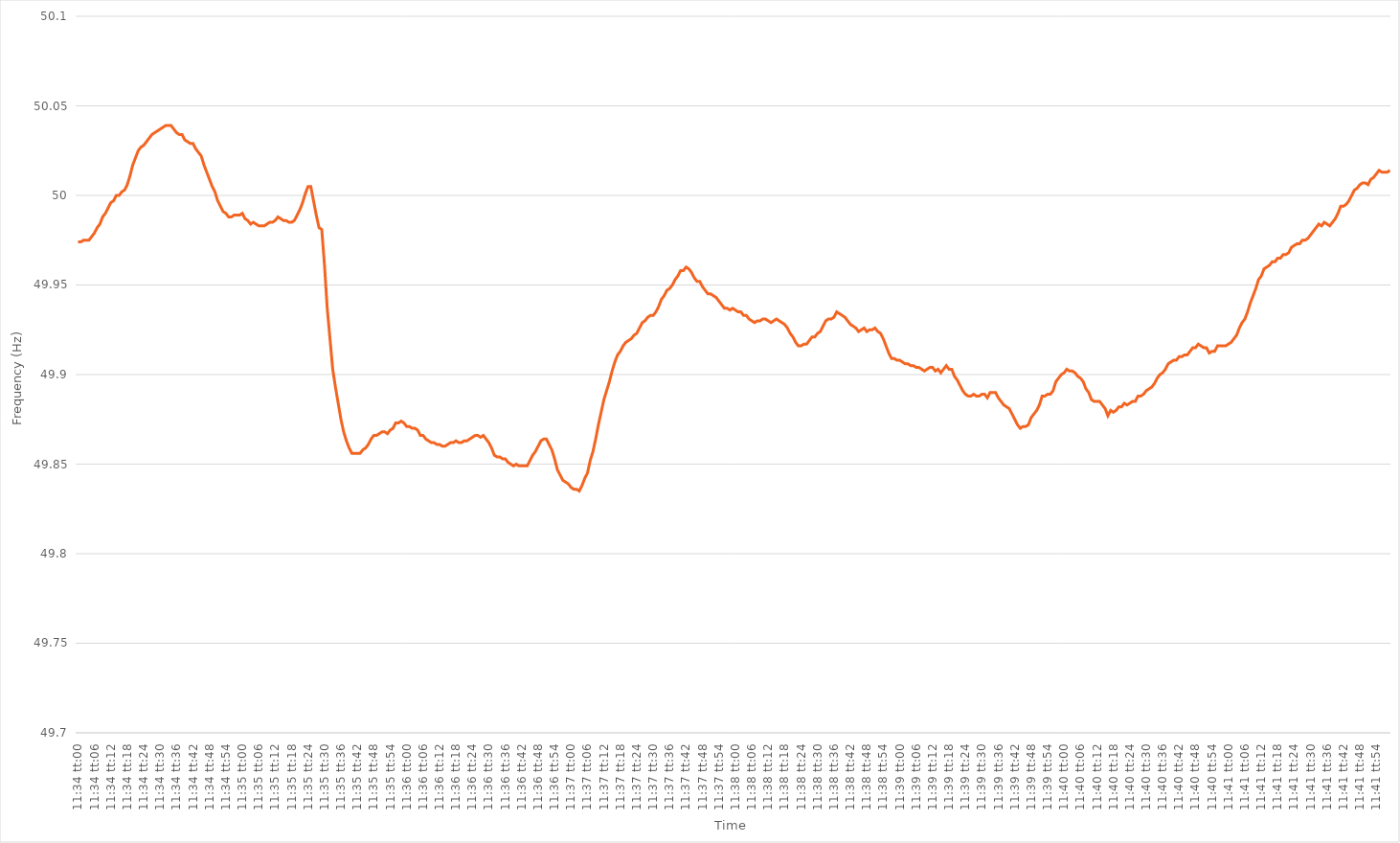
| Category | Series 0 |
|---|---|
| 0.48194444444444445 | 49.974 |
| 0.48195601851851855 | 49.974 |
| 0.4819675925925926 | 49.975 |
| 0.4819791666666667 | 49.975 |
| 0.4819907407407407 | 49.975 |
| 0.48200231481481487 | 49.977 |
| 0.4820138888888889 | 49.979 |
| 0.48202546296296295 | 49.982 |
| 0.48203703703703704 | 49.984 |
| 0.4820486111111111 | 49.988 |
| 0.4820601851851852 | 49.99 |
| 0.4820717592592592 | 49.993 |
| 0.48208333333333336 | 49.996 |
| 0.4820949074074074 | 49.997 |
| 0.4821064814814815 | 50 |
| 0.48211805555555554 | 50 |
| 0.48212962962962963 | 50.002 |
| 0.48214120370370367 | 50.003 |
| 0.4821527777777778 | 50.006 |
| 0.48216435185185186 | 50.011 |
| 0.48217592592592595 | 50.017 |
| 0.4821875 | 50.021 |
| 0.4821990740740741 | 50.025 |
| 0.4822106481481481 | 50.027 |
| 0.4822222222222223 | 50.028 |
| 0.4822337962962963 | 50.03 |
| 0.48224537037037035 | 50.032 |
| 0.48225694444444445 | 50.034 |
| 0.4822685185185185 | 50.035 |
| 0.4822800925925926 | 50.036 |
| 0.4822916666666666 | 50.037 |
| 0.48230324074074077 | 50.038 |
| 0.4823148148148148 | 50.039 |
| 0.4823263888888889 | 50.039 |
| 0.48233796296296294 | 50.039 |
| 0.48234953703703703 | 50.037 |
| 0.4823611111111111 | 50.035 |
| 0.4823726851851852 | 50.034 |
| 0.48238425925925926 | 50.034 |
| 0.48239583333333336 | 50.031 |
| 0.4824074074074074 | 50.03 |
| 0.4824189814814815 | 50.029 |
| 0.48243055555555553 | 50.029 |
| 0.4824421296296297 | 50.026 |
| 0.4824537037037037 | 50.024 |
| 0.4824652777777778 | 50.022 |
| 0.48247685185185185 | 50.017 |
| 0.4824884259259259 | 50.013 |
| 0.4825 | 50.009 |
| 0.482511574074074 | 50.005 |
| 0.4825231481481482 | 50.002 |
| 0.4825347222222222 | 49.997 |
| 0.4825462962962963 | 49.994 |
| 0.48255787037037035 | 49.991 |
| 0.48256944444444444 | 49.99 |
| 0.4825810185185185 | 49.988 |
| 0.48259259259259263 | 49.988 |
| 0.48260416666666667 | 49.989 |
| 0.48261574074074076 | 49.989 |
| 0.4826273148148148 | 49.989 |
| 0.4826388888888889 | 49.99 |
| 0.48265046296296293 | 49.987 |
| 0.4826620370370371 | 49.986 |
| 0.4826736111111111 | 49.984 |
| 0.4826851851851852 | 49.985 |
| 0.48269675925925926 | 49.984 |
| 0.48270833333333335 | 49.983 |
| 0.4827199074074074 | 49.983 |
| 0.48273148148148143 | 49.983 |
| 0.4827430555555556 | 49.984 |
| 0.4827546296296296 | 49.985 |
| 0.4827662037037037 | 49.985 |
| 0.48277777777777775 | 49.986 |
| 0.48278935185185184 | 49.988 |
| 0.4828009259259259 | 49.987 |
| 0.48281250000000003 | 49.986 |
| 0.48282407407407407 | 49.986 |
| 0.48283564814814817 | 49.985 |
| 0.4828472222222222 | 49.985 |
| 0.4828587962962963 | 49.986 |
| 0.48287037037037034 | 49.989 |
| 0.4828819444444445 | 49.992 |
| 0.4828935185185185 | 49.996 |
| 0.4829050925925926 | 50.001 |
| 0.48291666666666666 | 50.005 |
| 0.48292824074074076 | 50.005 |
| 0.4829398148148148 | 49.997 |
| 0.48295138888888894 | 49.989 |
| 0.482962962962963 | 49.982 |
| 0.482974537037037 | 49.981 |
| 0.4829861111111111 | 49.961 |
| 0.48299768518518515 | 49.937 |
| 0.48300925925925925 | 49.92 |
| 0.4830208333333333 | 49.903 |
| 0.48303240740740744 | 49.893 |
| 0.4830439814814815 | 49.884 |
| 0.48305555555555557 | 49.875 |
| 0.4830671296296296 | 49.868 |
| 0.4830787037037037 | 49.863 |
| 0.48309027777777774 | 49.859 |
| 0.4831018518518519 | 49.856 |
| 0.48311342592592593 | 49.856 |
| 0.483125 | 49.856 |
| 0.48313657407407407 | 49.856 |
| 0.48314814814814816 | 49.858 |
| 0.4831597222222222 | 49.859 |
| 0.48317129629629635 | 49.861 |
| 0.4831828703703704 | 49.864 |
| 0.4831944444444444 | 49.866 |
| 0.4832060185185185 | 49.866 |
| 0.48321759259259256 | 49.867 |
| 0.48322916666666665 | 49.868 |
| 0.4832407407407407 | 49.868 |
| 0.48325231481481484 | 49.867 |
| 0.4832638888888889 | 49.869 |
| 0.483275462962963 | 49.87 |
| 0.483287037037037 | 49.873 |
| 0.4832986111111111 | 49.873 |
| 0.48331018518518515 | 49.874 |
| 0.4833217592592593 | 49.873 |
| 0.48333333333333334 | 49.871 |
| 0.48334490740740743 | 49.871 |
| 0.48335648148148147 | 49.87 |
| 0.48336805555555556 | 49.87 |
| 0.4833796296296296 | 49.869 |
| 0.48339120370370375 | 49.866 |
| 0.4834027777777778 | 49.866 |
| 0.4834143518518519 | 49.864 |
| 0.4834259259259259 | 49.863 |
| 0.48343749999999996 | 49.862 |
| 0.48344907407407406 | 49.862 |
| 0.4834606481481481 | 49.861 |
| 0.48347222222222225 | 49.861 |
| 0.4834837962962963 | 49.86 |
| 0.4834953703703704 | 49.86 |
| 0.4835069444444444 | 49.861 |
| 0.4835185185185185 | 49.862 |
| 0.48353009259259255 | 49.862 |
| 0.4835416666666667 | 49.863 |
| 0.48355324074074074 | 49.862 |
| 0.48356481481481484 | 49.862 |
| 0.4835763888888889 | 49.863 |
| 0.48358796296296297 | 49.863 |
| 0.483599537037037 | 49.864 |
| 0.48361111111111116 | 49.865 |
| 0.4836226851851852 | 49.866 |
| 0.4836342592592593 | 49.866 |
| 0.48364583333333333 | 49.865 |
| 0.4836574074074074 | 49.866 |
| 0.48366898148148146 | 49.864 |
| 0.4836805555555555 | 49.862 |
| 0.48369212962962965 | 49.859 |
| 0.4837037037037037 | 49.855 |
| 0.4837152777777778 | 49.854 |
| 0.4837268518518518 | 49.854 |
| 0.4837384259259259 | 49.853 |
| 0.48374999999999996 | 49.853 |
| 0.4837615740740741 | 49.851 |
| 0.48377314814814815 | 49.85 |
| 0.48378472222222224 | 49.849 |
| 0.4837962962962963 | 49.85 |
| 0.4838078703703704 | 49.849 |
| 0.4838194444444444 | 49.849 |
| 0.48383101851851856 | 49.849 |
| 0.4838425925925926 | 49.849 |
| 0.4838541666666667 | 49.852 |
| 0.48386574074074074 | 49.855 |
| 0.48387731481481483 | 49.857 |
| 0.48388888888888887 | 49.86 |
| 0.483900462962963 | 49.863 |
| 0.48391203703703706 | 49.864 |
| 0.4839236111111111 | 49.864 |
| 0.4839351851851852 | 49.861 |
| 0.48394675925925923 | 49.858 |
| 0.4839583333333333 | 49.853 |
| 0.48396990740740736 | 49.847 |
| 0.4839814814814815 | 49.844 |
| 0.48399305555555555 | 49.841 |
| 0.48400462962962965 | 49.84 |
| 0.4840162037037037 | 49.839 |
| 0.4840277777777778 | 49.837 |
| 0.4840393518518518 | 49.836 |
| 0.48405092592592597 | 49.836 |
| 0.4840625 | 49.835 |
| 0.4840740740740741 | 49.838 |
| 0.48408564814814814 | 49.842 |
| 0.48409722222222223 | 49.845 |
| 0.4841087962962963 | 49.852 |
| 0.4841203703703704 | 49.857 |
| 0.48413194444444446 | 49.864 |
| 0.4841435185185185 | 49.872 |
| 0.4841550925925926 | 49.879 |
| 0.48416666666666663 | 49.886 |
| 0.48417824074074073 | 49.891 |
| 0.48418981481481477 | 49.896 |
| 0.4842013888888889 | 49.902 |
| 0.48421296296296296 | 49.907 |
| 0.48422453703703705 | 49.911 |
| 0.4842361111111111 | 49.913 |
| 0.4842476851851852 | 49.916 |
| 0.4842592592592592 | 49.918 |
| 0.4842708333333334 | 49.919 |
| 0.4842824074074074 | 49.92 |
| 0.4842939814814815 | 49.922 |
| 0.48430555555555554 | 49.923 |
| 0.48431712962962964 | 49.926 |
| 0.4843287037037037 | 49.929 |
| 0.48434027777777783 | 49.93 |
| 0.48435185185185187 | 49.932 |
| 0.48436342592592596 | 49.933 |
| 0.484375 | 49.933 |
| 0.48438657407407404 | 49.935 |
| 0.48439814814814813 | 49.938 |
| 0.48440972222222217 | 49.942 |
| 0.4844212962962963 | 49.944 |
| 0.48443287037037036 | 49.947 |
| 0.48444444444444446 | 49.948 |
| 0.4844560185185185 | 49.95 |
| 0.4844675925925926 | 49.953 |
| 0.4844791666666666 | 49.955 |
| 0.4844907407407408 | 49.958 |
| 0.4845023148148148 | 49.958 |
| 0.4845138888888889 | 49.96 |
| 0.48452546296296295 | 49.959 |
| 0.48453703703703704 | 49.957 |
| 0.4845486111111111 | 49.954 |
| 0.48456018518518523 | 49.952 |
| 0.48457175925925927 | 49.952 |
| 0.48458333333333337 | 49.949 |
| 0.4845949074074074 | 49.947 |
| 0.4846064814814815 | 49.945 |
| 0.48461805555555554 | 49.945 |
| 0.4846296296296296 | 49.944 |
| 0.4846412037037037 | 49.943 |
| 0.48465277777777777 | 49.941 |
| 0.48466435185185186 | 49.939 |
| 0.4846759259259259 | 49.937 |
| 0.4846875 | 49.937 |
| 0.48469907407407403 | 49.936 |
| 0.4847106481481482 | 49.937 |
| 0.4847222222222222 | 49.936 |
| 0.4847337962962963 | 49.935 |
| 0.48474537037037035 | 49.935 |
| 0.48475694444444445 | 49.933 |
| 0.4847685185185185 | 49.933 |
| 0.48478009259259264 | 49.931 |
| 0.4847916666666667 | 49.93 |
| 0.48480324074074077 | 49.929 |
| 0.4848148148148148 | 49.93 |
| 0.4848263888888889 | 49.93 |
| 0.48483796296296294 | 49.931 |
| 0.484849537037037 | 49.931 |
| 0.48486111111111113 | 49.93 |
| 0.48487268518518517 | 49.929 |
| 0.48488425925925926 | 49.93 |
| 0.4848958333333333 | 49.931 |
| 0.4849074074074074 | 49.93 |
| 0.48491898148148144 | 49.929 |
| 0.4849305555555556 | 49.928 |
| 0.4849421296296296 | 49.926 |
| 0.4849537037037037 | 49.923 |
| 0.48496527777777776 | 49.921 |
| 0.48497685185185185 | 49.918 |
| 0.4849884259259259 | 49.916 |
| 0.48500000000000004 | 49.916 |
| 0.4850115740740741 | 49.917 |
| 0.4850231481481482 | 49.917 |
| 0.4850347222222222 | 49.919 |
| 0.4850462962962963 | 49.921 |
| 0.48505787037037035 | 49.921 |
| 0.4850694444444445 | 49.923 |
| 0.48508101851851854 | 49.924 |
| 0.4850925925925926 | 49.927 |
| 0.48510416666666667 | 49.93 |
| 0.4851157407407407 | 49.931 |
| 0.4851273148148148 | 49.931 |
| 0.48513888888888884 | 49.932 |
| 0.485150462962963 | 49.935 |
| 0.48516203703703703 | 49.934 |
| 0.4851736111111111 | 49.933 |
| 0.48518518518518516 | 49.932 |
| 0.48519675925925926 | 49.93 |
| 0.4852083333333333 | 49.928 |
| 0.48521990740740745 | 49.927 |
| 0.4852314814814815 | 49.926 |
| 0.4852430555555556 | 49.924 |
| 0.4852546296296296 | 49.925 |
| 0.4852662037037037 | 49.926 |
| 0.48527777777777775 | 49.924 |
| 0.4852893518518519 | 49.925 |
| 0.48530092592592594 | 49.925 |
| 0.48531250000000004 | 49.926 |
| 0.4853240740740741 | 49.924 |
| 0.4853356481481481 | 49.923 |
| 0.4853472222222222 | 49.92 |
| 0.48535879629629625 | 49.916 |
| 0.4853703703703704 | 49.912 |
| 0.48538194444444444 | 49.909 |
| 0.48539351851851853 | 49.909 |
| 0.48540509259259257 | 49.908 |
| 0.48541666666666666 | 49.908 |
| 0.4854282407407407 | 49.907 |
| 0.48543981481481485 | 49.906 |
| 0.4854513888888889 | 49.906 |
| 0.485462962962963 | 49.905 |
| 0.485474537037037 | 49.905 |
| 0.4854861111111111 | 49.904 |
| 0.48549768518518516 | 49.904 |
| 0.4855092592592593 | 49.903 |
| 0.48552083333333335 | 49.902 |
| 0.48553240740740744 | 49.903 |
| 0.4855439814814815 | 49.904 |
| 0.4855555555555556 | 49.904 |
| 0.4855671296296296 | 49.902 |
| 0.48557870370370365 | 49.903 |
| 0.4855902777777778 | 49.901 |
| 0.48560185185185184 | 49.903 |
| 0.48561342592592593 | 49.905 |
| 0.485625 | 49.903 |
| 0.48563657407407407 | 49.903 |
| 0.4856481481481481 | 49.899 |
| 0.48565972222222226 | 49.897 |
| 0.4856712962962963 | 49.894 |
| 0.4856828703703704 | 49.891 |
| 0.48569444444444443 | 49.889 |
| 0.4857060185185185 | 49.888 |
| 0.48571759259259256 | 49.888 |
| 0.4857291666666667 | 49.889 |
| 0.48574074074074075 | 49.888 |
| 0.48575231481481485 | 49.888 |
| 0.4857638888888889 | 49.889 |
| 0.485775462962963 | 49.889 |
| 0.485787037037037 | 49.887 |
| 0.48579861111111106 | 49.89 |
| 0.4858101851851852 | 49.89 |
| 0.48582175925925924 | 49.89 |
| 0.48583333333333334 | 49.887 |
| 0.4858449074074074 | 49.885 |
| 0.4858564814814815 | 49.883 |
| 0.4858680555555555 | 49.882 |
| 0.48587962962962966 | 49.881 |
| 0.4858912037037037 | 49.878 |
| 0.4859027777777778 | 49.875 |
| 0.48591435185185183 | 49.872 |
| 0.48592592592592593 | 49.87 |
| 0.48593749999999997 | 49.871 |
| 0.4859490740740741 | 49.871 |
| 0.48596064814814816 | 49.872 |
| 0.48597222222222225 | 49.876 |
| 0.4859837962962963 | 49.878 |
| 0.4859953703703704 | 49.88 |
| 0.4860069444444444 | 49.883 |
| 0.48601851851851857 | 49.888 |
| 0.4860300925925926 | 49.888 |
| 0.48604166666666665 | 49.889 |
| 0.48605324074074074 | 49.889 |
| 0.4860648148148148 | 49.891 |
| 0.4860763888888889 | 49.896 |
| 0.4860879629629629 | 49.898 |
| 0.48609953703703707 | 49.9 |
| 0.4861111111111111 | 49.901 |
| 0.4861226851851852 | 49.903 |
| 0.48613425925925924 | 49.902 |
| 0.48614583333333333 | 49.902 |
| 0.48615740740740737 | 49.901 |
| 0.4861689814814815 | 49.899 |
| 0.48618055555555556 | 49.898 |
| 0.48619212962962965 | 49.896 |
| 0.4862037037037037 | 49.892 |
| 0.4862152777777778 | 49.89 |
| 0.4862268518518518 | 49.886 |
| 0.486238425925926 | 49.885 |
| 0.48625 | 49.885 |
| 0.4862615740740741 | 49.885 |
| 0.48627314814814815 | 49.883 |
| 0.4862847222222222 | 49.881 |
| 0.4862962962962963 | 49.877 |
| 0.4863078703703703 | 49.88 |
| 0.48631944444444447 | 49.879 |
| 0.4863310185185185 | 49.88 |
| 0.4863425925925926 | 49.882 |
| 0.48635416666666664 | 49.882 |
| 0.48636574074074074 | 49.884 |
| 0.4863773148148148 | 49.883 |
| 0.4863888888888889 | 49.884 |
| 0.48640046296296297 | 49.885 |
| 0.48641203703703706 | 49.885 |
| 0.4864236111111111 | 49.888 |
| 0.4864351851851852 | 49.888 |
| 0.48644675925925923 | 49.889 |
| 0.4864583333333334 | 49.891 |
| 0.4864699074074074 | 49.892 |
| 0.4864814814814815 | 49.893 |
| 0.48649305555555555 | 49.895 |
| 0.48650462962962965 | 49.898 |
| 0.4865162037037037 | 49.9 |
| 0.4865277777777777 | 49.901 |
| 0.4865393518518519 | 49.903 |
| 0.4865509259259259 | 49.906 |
| 0.4865625 | 49.907 |
| 0.48657407407407405 | 49.908 |
| 0.48658564814814814 | 49.908 |
| 0.4865972222222222 | 49.91 |
| 0.48660879629629633 | 49.91 |
| 0.48662037037037037 | 49.911 |
| 0.48663194444444446 | 49.911 |
| 0.4866435185185185 | 49.913 |
| 0.4866550925925926 | 49.915 |
| 0.48666666666666664 | 49.915 |
| 0.4866782407407408 | 49.917 |
| 0.4866898148148148 | 49.916 |
| 0.4867013888888889 | 49.915 |
| 0.48671296296296296 | 49.915 |
| 0.48672453703703705 | 49.912 |
| 0.4867361111111111 | 49.913 |
| 0.48674768518518513 | 49.913 |
| 0.4867592592592593 | 49.916 |
| 0.4867708333333333 | 49.916 |
| 0.4867824074074074 | 49.916 |
| 0.48679398148148145 | 49.916 |
| 0.48680555555555555 | 49.917 |
| 0.4868171296296296 | 49.918 |
| 0.48682870370370374 | 49.92 |
| 0.4868402777777778 | 49.922 |
| 0.48685185185185187 | 49.926 |
| 0.4868634259259259 | 49.929 |
| 0.486875 | 49.931 |
| 0.48688657407407404 | 49.935 |
| 0.4868981481481482 | 49.94 |
| 0.48690972222222223 | 49.944 |
| 0.4869212962962963 | 49.948 |
| 0.48693287037037036 | 49.953 |
| 0.48694444444444446 | 49.955 |
| 0.4869560185185185 | 49.959 |
| 0.48696759259259265 | 49.96 |
| 0.4869791666666667 | 49.961 |
| 0.4869907407407407 | 49.963 |
| 0.4870023148148148 | 49.963 |
| 0.48701388888888886 | 49.965 |
| 0.48702546296296295 | 49.965 |
| 0.487037037037037 | 49.967 |
| 0.48704861111111114 | 49.967 |
| 0.4870601851851852 | 49.968 |
| 0.4870717592592593 | 49.971 |
| 0.4870833333333333 | 49.972 |
| 0.4870949074074074 | 49.973 |
| 0.48710648148148145 | 49.973 |
| 0.4871180555555556 | 49.975 |
| 0.48712962962962963 | 49.975 |
| 0.48714120370370373 | 49.976 |
| 0.48715277777777777 | 49.978 |
| 0.48716435185185186 | 49.98 |
| 0.4871759259259259 | 49.982 |
| 0.48718750000000005 | 49.984 |
| 0.4871990740740741 | 49.983 |
| 0.4872106481481482 | 49.985 |
| 0.4872222222222222 | 49.984 |
| 0.48723379629629626 | 49.983 |
| 0.48724537037037036 | 49.985 |
| 0.4872569444444444 | 49.987 |
| 0.48726851851851855 | 49.99 |
| 0.4872800925925926 | 49.994 |
| 0.4872916666666667 | 49.994 |
| 0.4873032407407407 | 49.995 |
| 0.4873148148148148 | 49.997 |
| 0.48732638888888885 | 50 |
| 0.487337962962963 | 50.003 |
| 0.48734953703703704 | 50.004 |
| 0.48736111111111113 | 50.006 |
| 0.4873726851851852 | 50.007 |
| 0.48738425925925927 | 50.007 |
| 0.4873958333333333 | 50.006 |
| 0.48740740740740746 | 50.009 |
| 0.4874189814814815 | 50.01 |
| 0.4874305555555556 | 50.012 |
| 0.48744212962962963 | 50.014 |
| 0.48745370370370367 | 50.013 |
| 0.48746527777777776 | 50.013 |
| 0.4874768518518518 | 50.013 |
| 0.48748842592592595 | 50.014 |